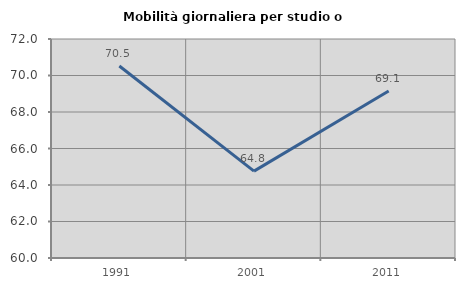
| Category | Mobilità giornaliera per studio o lavoro |
|---|---|
| 1991.0 | 70.522 |
| 2001.0 | 64.761 |
| 2011.0 | 69.149 |